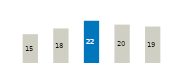
| Category | Other variable cost |
|---|---|
| 0 | 15 |
| 1 | 18 |
| 2 | 22 |
| 3 | 20 |
| 4 | 19 |